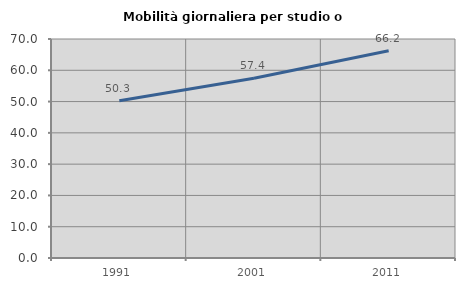
| Category | Mobilità giornaliera per studio o lavoro |
|---|---|
| 1991.0 | 50.276 |
| 2001.0 | 57.438 |
| 2011.0 | 66.233 |